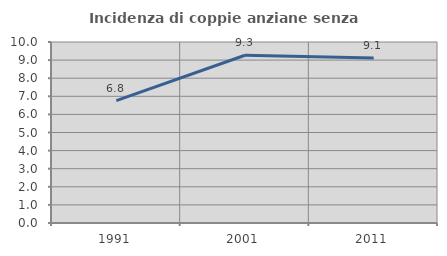
| Category | Incidenza di coppie anziane senza figli  |
|---|---|
| 1991.0 | 6.757 |
| 2001.0 | 9.266 |
| 2011.0 | 9.114 |